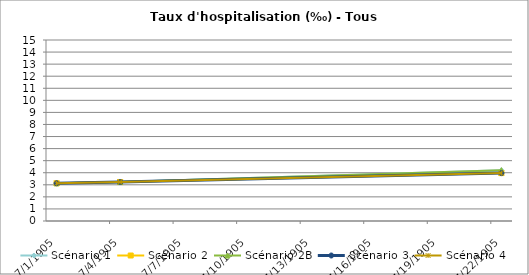
| Category | Scénario 1 | Scénario 2 | Scénario 2B | Scénario 3 | Scénario 4 |
|---|---|---|---|---|---|
| 2009.0 | 3.128 | 3.128 | 3.128 | 3.128 | 3.128 |
| 2012.0 | 3.229 | 3.229 | 3.229 | 3.229 | 3.229 |
| 2030.0 | 4.212 | 3.969 | 4.212 | 3.969 | 3.969 |